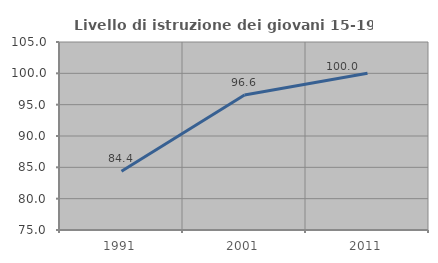
| Category | Livello di istruzione dei giovani 15-19 anni |
|---|---|
| 1991.0 | 84.375 |
| 2001.0 | 96.552 |
| 2011.0 | 100 |